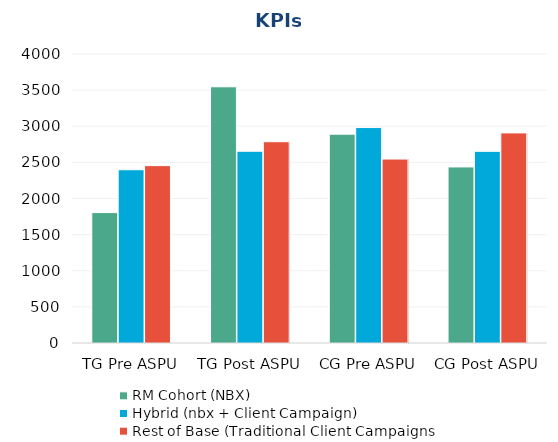
| Category | RM Cohort (NBX)  | Hybrid (nbx + Client Campaign) | Rest of Base (Traditional Client Campaigns |
|---|---|---|---|
| TG Pre ASPU | 1805 | 2398 | 2455 |
| TG Post ASPU | 3546 | 2654 | 2786 |
| CG Pre ASPU | 2890 | 2982 | 2546 |
| CG Post ASPU | 2437 | 2653 | 2908 |